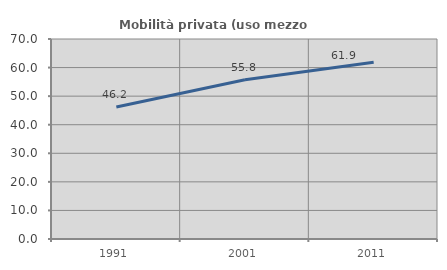
| Category | Mobilità privata (uso mezzo privato) |
|---|---|
| 1991.0 | 46.175 |
| 2001.0 | 55.767 |
| 2011.0 | 61.896 |